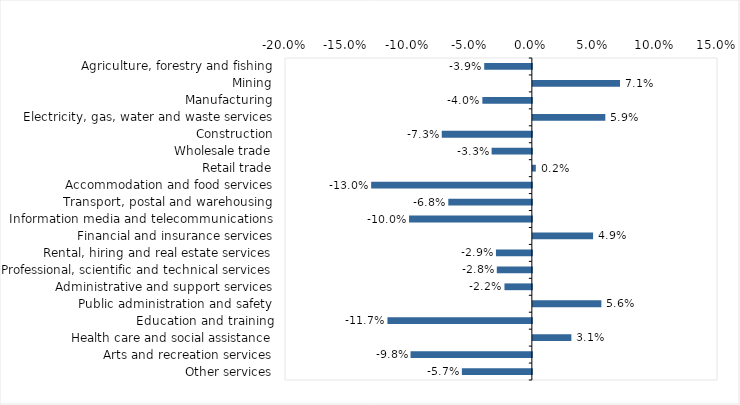
| Category | This week |
|---|---|
| Agriculture, forestry and fishing | -0.039 |
| Mining | 0.071 |
| Manufacturing | -0.04 |
| Electricity, gas, water and waste services | 0.059 |
| Construction | -0.073 |
| Wholesale trade | -0.033 |
| Retail trade | 0.002 |
| Accommodation and food services | -0.13 |
| Transport, postal and warehousing | -0.068 |
| Information media and telecommunications | -0.1 |
| Financial and insurance services | 0.049 |
| Rental, hiring and real estate services | -0.029 |
| Professional, scientific and technical services | -0.028 |
| Administrative and support services | -0.022 |
| Public administration and safety | 0.056 |
| Education and training | -0.117 |
| Health care and social assistance | 0.031 |
| Arts and recreation services | -0.098 |
| Other services | -0.057 |